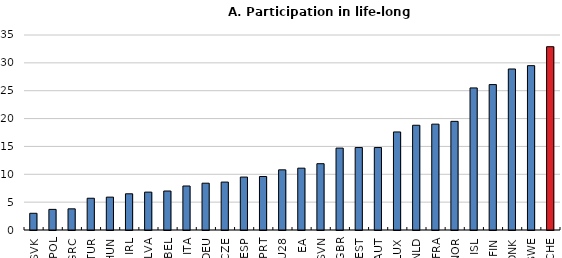
| Category | All ISCED 2011 levels  |
|---|---|
| SVK | 3 |
| POL | 3.7 |
| GRC | 3.8 |
| TUR | 5.7 |
| HUN | 5.9 |
| IRL | 6.5 |
| LVA | 6.8 |
| BEL | 7 |
| ITA | 7.9 |
| DEU | 8.4 |
| CZE | 8.6 |
| ESP | 9.5 |
| PRT | 9.6 |
| EU28 | 10.8 |
| EA | 11.1 |
| SVN | 11.9 |
| GBR | 14.7 |
| EST | 14.8 |
| AUT | 14.8 |
| LUX | 17.6 |
| NLD | 18.8 |
| FRA | 19 |
| NOR | 19.5 |
| ISL | 25.5 |
| FIN | 26.1 |
| DNK | 28.9 |
| SWE | 29.5 |
| CHE | 32.9 |